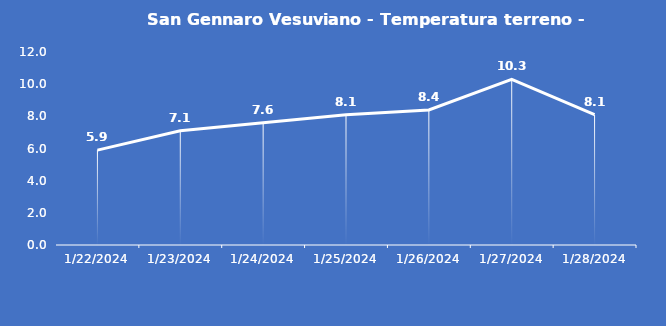
| Category | San Gennaro Vesuviano - Temperatura terreno - Grezzo (°C) |
|---|---|
| 1/22/24 | 5.9 |
| 1/23/24 | 7.1 |
| 1/24/24 | 7.6 |
| 1/25/24 | 8.1 |
| 1/26/24 | 8.4 |
| 1/27/24 | 10.3 |
| 1/28/24 | 8.1 |